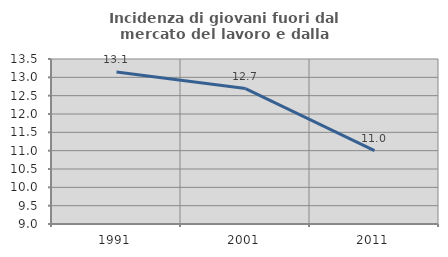
| Category | Incidenza di giovani fuori dal mercato del lavoro e dalla formazione  |
|---|---|
| 1991.0 | 13.145 |
| 2001.0 | 12.694 |
| 2011.0 | 10.999 |